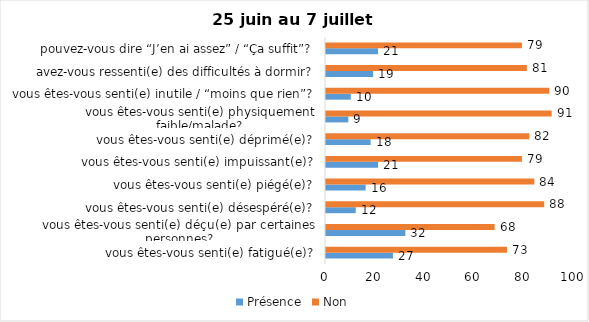
| Category | Présence | Non |
|---|---|---|
| vous êtes-vous senti(e) fatigué(e)? | 27 | 73 |
| vous êtes-vous senti(e) déçu(e) par certaines personnes? | 32 | 68 |
| vous êtes-vous senti(e) désespéré(e)? | 12 | 88 |
| vous êtes-vous senti(e) piégé(e)? | 16 | 84 |
| vous êtes-vous senti(e) impuissant(e)? | 21 | 79 |
| vous êtes-vous senti(e) déprimé(e)? | 18 | 82 |
| vous êtes-vous senti(e) physiquement faible/malade? | 9 | 91 |
| vous êtes-vous senti(e) inutile / “moins que rien”? | 10 | 90 |
| avez-vous ressenti(e) des difficultés à dormir? | 19 | 81 |
| pouvez-vous dire “J’en ai assez” / “Ça suffit”? | 21 | 79 |